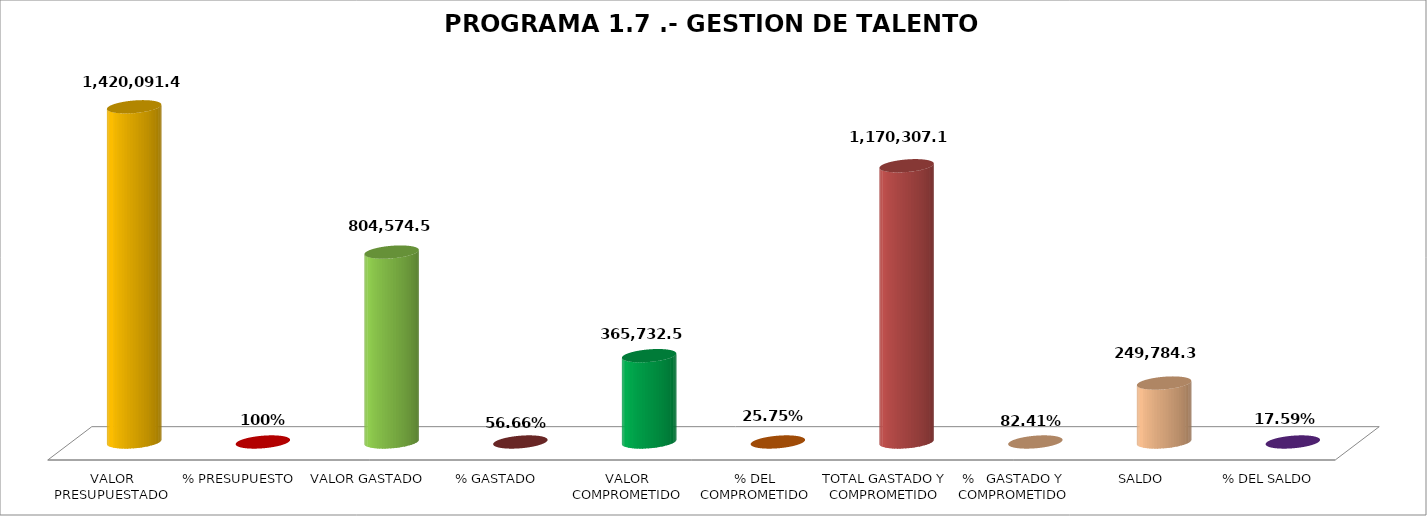
| Category | PROGRAMA 1.7 .- GESTION DE TALENTO HUMANO |
|---|---|
| VALOR PRESUPUESTADO | 1420091.48 |
| % PRESUPUESTO | 1 |
| VALOR GASTADO | 804574.59 |
| % GASTADO | 0.567 |
| VALOR COMPROMETIDO | 365732.57 |
| % DEL COMPROMETIDO | 0.258 |
| TOTAL GASTADO Y COMPROMETIDO | 1170307.16 |
| %   GASTADO Y COMPROMETIDO | 0.824 |
| SALDO | 249784.32 |
| % DEL SALDO | 0.176 |